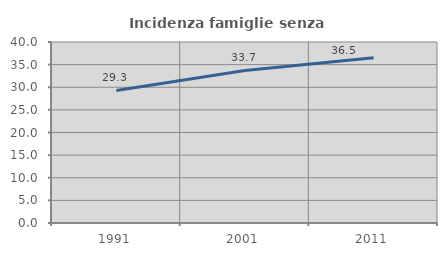
| Category | Incidenza famiglie senza nuclei |
|---|---|
| 1991.0 | 29.288 |
| 2001.0 | 33.708 |
| 2011.0 | 36.503 |